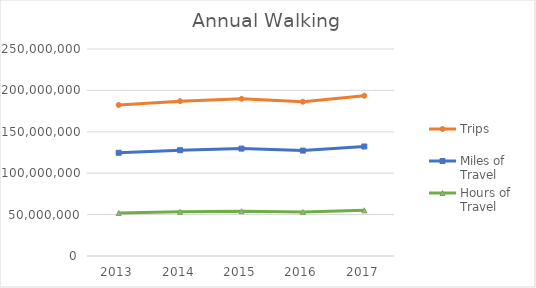
| Category | Trips | Miles of Travel | Hours of Travel |
|---|---|---|---|
| 2013 | 182411716.673 | 124632805.417 | 51975604.098 |
| 2014 | 187034837.995 | 127791553.06 | 53292896.254 |
| 2015 | 189845376.212 | 129711853.297 | 54093718.835 |
| 2016 | 186315481.495 | 127300052.732 | 53087925.93 |
| 2017 | 193576935.774 | 132261441.368 | 55156973.246 |